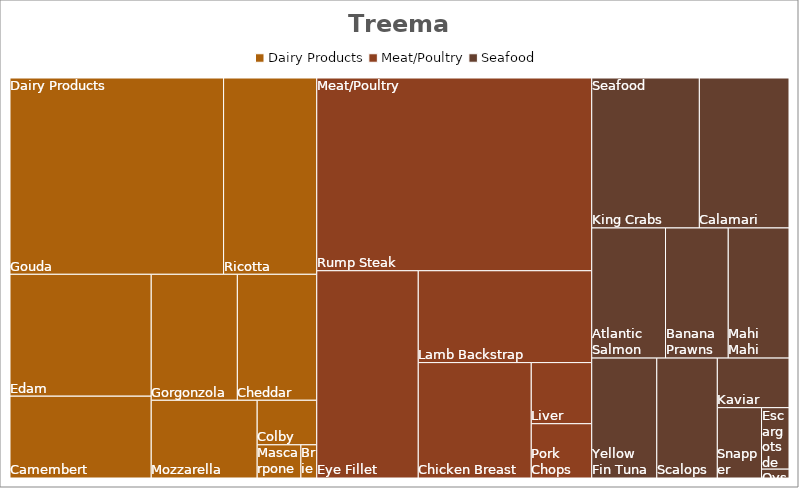
| Category | Total |
|---|---|
| 0 | 195 |
| 1 | 537.6 |
| 2 | 984.38 |
| 3 | 3053.7 |
| 4 | 3708.75 |
| 5 | 4022.81 |
| 6 | 4284 |
| 7 | 6384 |
| 8 | 6782.4 |
| 9 | 15547.68 |
| 10 | 1216.8 |
| 11 | 1370.5 |
| 12 | 4835.38 |
| 13 | 5907.3 |
| 14 | 7800.2 |
| 15 | 19652.91 |
| 16 | 90 |
| 17 | 626.07 |
| 18 | 1152.48 |
| 19 | 1317.75 |
| 20 | 2691.26 |
| 21 | 2892.75 |
| 22 | 2930.51 |
| 23 | 3026.8 |
| 24 | 3559.88 |
| 25 | 4984.8 |
| 26 | 5985 |